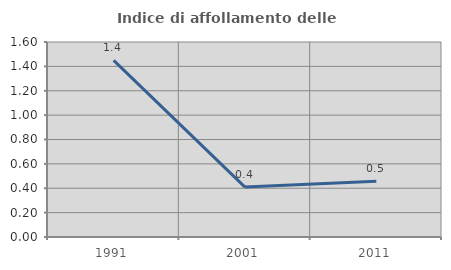
| Category | Indice di affollamento delle abitazioni  |
|---|---|
| 1991.0 | 1.449 |
| 2001.0 | 0.41 |
| 2011.0 | 0.457 |